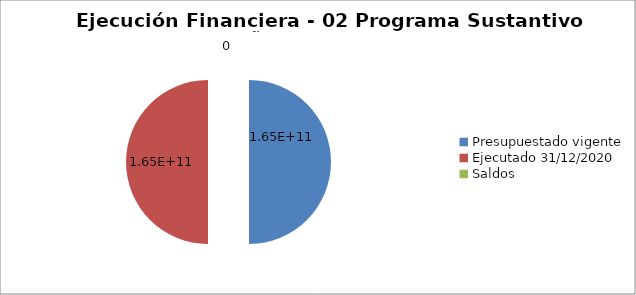
| Category | 0 0 |
|---|---|
| Presupuestado vigente | 165000000000 |
| Ejecutado 31/12/2020 | 165000000000 |
| Saldos | 0 |